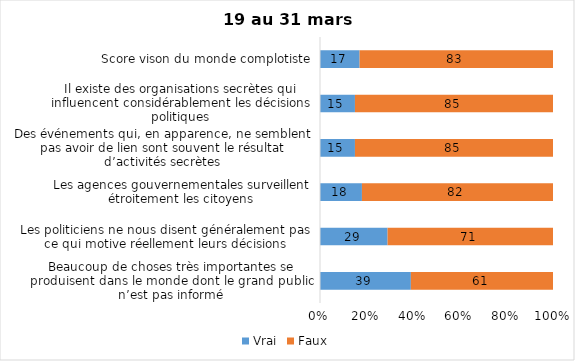
| Category | Vrai | Faux |
|---|---|---|
| Beaucoup de choses très importantes se produisent dans le monde dont le grand public n’est pas informé | 39 | 61 |
| Les politiciens ne nous disent généralement pas ce qui motive réellement leurs décisions | 29 | 71 |
| Les agences gouvernementales surveillent étroitement les citoyens | 18 | 82 |
| Des événements qui, en apparence, ne semblent pas avoir de lien sont souvent le résultat d’activités secrètes | 15 | 85 |
| Il existe des organisations secrètes qui influencent considérablement les décisions politiques | 15 | 85 |
| Score vison du monde complotiste | 17 | 83 |